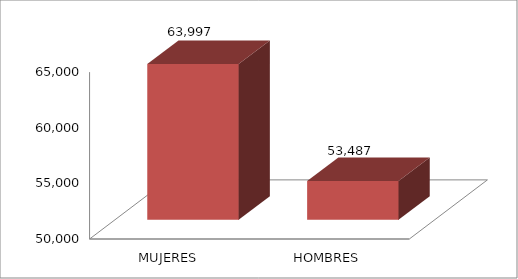
| Category | Series 0 |
|---|---|
| MUJERES | 63997 |
| HOMBRES | 53487 |